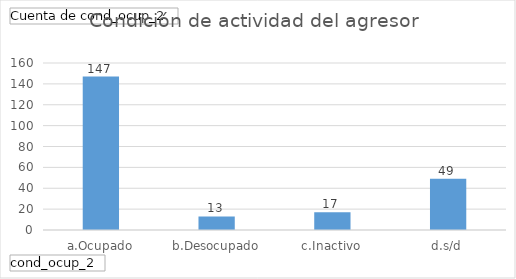
| Category | Total |
|---|---|
| a.Ocupado | 147 |
| b.Desocupado | 13 |
| c.Inactivo | 17 |
| d.s/d | 49 |